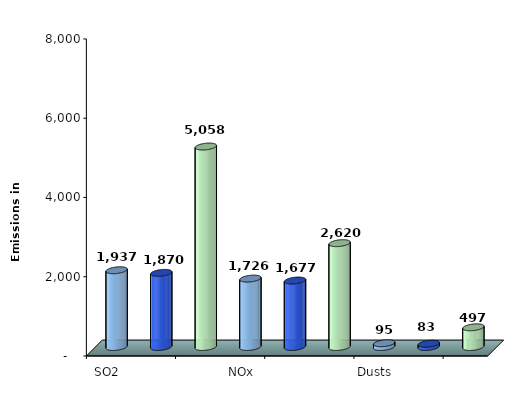
| Category | Series 0 |
|---|---|
| SO2 | 1937 |
|  | 1870.31 |
|  | 5057.77 |
| NOx | 1726 |
|  | 1677 |
|  | 2620.27 |
| Dusts | 95 |